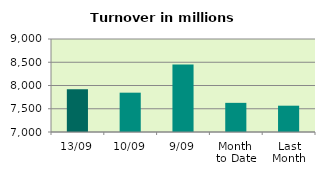
| Category | Series 0 |
|---|---|
| 13/09 | 7917.154 |
| 10/09 | 7845.692 |
| 9/09 | 8449.136 |
| Month 
to Date | 7626.932 |
| Last
Month | 7565.704 |